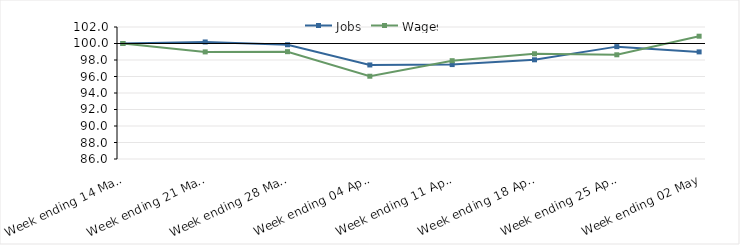
| Category | Jobs | Wages |
|---|---|---|
| 2020-03-14 | 100 | 100 |
| 2020-03-21 | 100.185 | 98.981 |
| 2020-03-28 | 99.85 | 99.007 |
| 2020-04-04 | 97.399 | 96.034 |
| 2020-04-11 | 97.445 | 97.915 |
| 2020-04-18 | 98.024 | 98.755 |
| 2020-04-25 | 99.62 | 98.632 |
| 2020-05-02 | 98.984 | 100.884 |